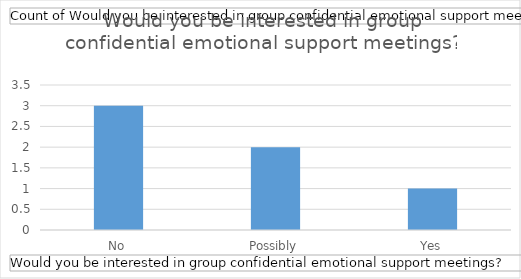
| Category | Total |
|---|---|
| No | 3 |
| Possibly | 2 |
| Yes | 1 |